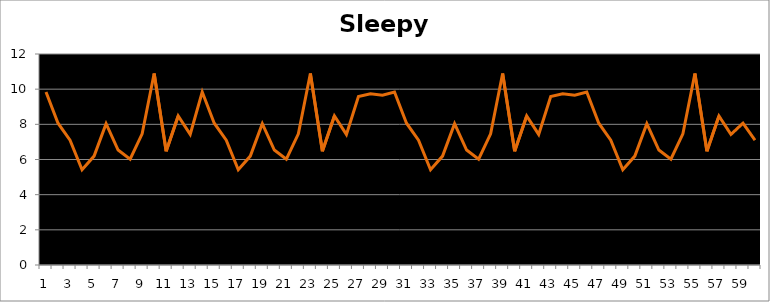
| Category | Sleepy |
|---|---|
| 0 | 9.84 |
| 1 | 8.066 |
| 2 | 7.099 |
| 3 | 5.417 |
| 4 | 6.193 |
| 5 | 8.037 |
| 6 | 6.54 |
| 7 | 6.018 |
| 8 | 7.462 |
| 9 | 10.888 |
| 10 | 6.469 |
| 11 | 8.474 |
| 12 | 7.427 |
| 13 | 9.84 |
| 14 | 8.066 |
| 15 | 7.099 |
| 16 | 5.417 |
| 17 | 6.193 |
| 18 | 8.037 |
| 19 | 6.54 |
| 20 | 6.018 |
| 21 | 7.462 |
| 22 | 10.888 |
| 23 | 6.469 |
| 24 | 8.474 |
| 25 | 7.427 |
| 26 | 9.582 |
| 27 | 9.734 |
| 28 | 9.655 |
| 29 | 9.84 |
| 30 | 8.066 |
| 31 | 7.099 |
| 32 | 5.417 |
| 33 | 6.193 |
| 34 | 8.037 |
| 35 | 6.54 |
| 36 | 6.018 |
| 37 | 7.462 |
| 38 | 10.888 |
| 39 | 6.469 |
| 40 | 8.474 |
| 41 | 7.427 |
| 42 | 9.582 |
| 43 | 9.734 |
| 44 | 9.655 |
| 45 | 9.84 |
| 46 | 8.066 |
| 47 | 7.099 |
| 48 | 5.417 |
| 49 | 6.193 |
| 50 | 8.037 |
| 51 | 6.54 |
| 52 | 6.018 |
| 53 | 7.462 |
| 54 | 10.888 |
| 55 | 6.469 |
| 56 | 8.474 |
| 57 | 7.427 |
| 58 | 8.066 |
| 59 | 7.099 |